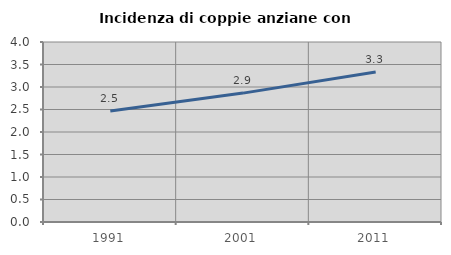
| Category | Incidenza di coppie anziane con figli |
|---|---|
| 1991.0 | 2.469 |
| 2001.0 | 2.864 |
| 2011.0 | 3.335 |